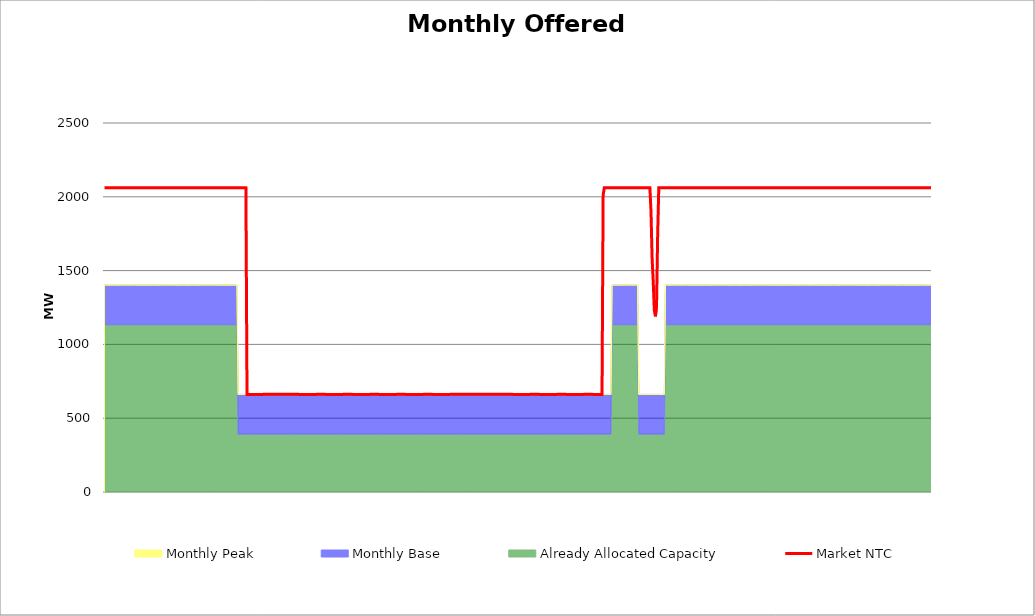
| Category | Market NTC |
|---|---|
| 0 | 2062 |
| 1 | 2062 |
| 2 | 2062 |
| 3 | 2062 |
| 4 | 2062 |
| 5 | 2062 |
| 6 | 2062 |
| 7 | 2061 |
| 8 | 2061 |
| 9 | 2061 |
| 10 | 2061 |
| 11 | 2061 |
| 12 | 2061 |
| 13 | 2061 |
| 14 | 2061 |
| 15 | 2061 |
| 16 | 2061 |
| 17 | 2061 |
| 18 | 2061 |
| 19 | 2061 |
| 20 | 2061 |
| 21 | 2061 |
| 22 | 2061 |
| 23 | 2062 |
| 24 | 2062 |
| 25 | 2062 |
| 26 | 2062 |
| 27 | 2062 |
| 28 | 2062 |
| 29 | 2062 |
| 30 | 2062 |
| 31 | 2061 |
| 32 | 2061 |
| 33 | 2061 |
| 34 | 2061 |
| 35 | 2061 |
| 36 | 2061 |
| 37 | 2061 |
| 38 | 2061 |
| 39 | 2061 |
| 40 | 2061 |
| 41 | 2061 |
| 42 | 2061 |
| 43 | 2061 |
| 44 | 2061 |
| 45 | 2061 |
| 46 | 2061 |
| 47 | 2062 |
| 48 | 2062 |
| 49 | 2062 |
| 50 | 2062 |
| 51 | 2062 |
| 52 | 2062 |
| 53 | 2062 |
| 54 | 2062 |
| 55 | 2061 |
| 56 | 2061 |
| 57 | 2061 |
| 58 | 2061 |
| 59 | 2061 |
| 60 | 2061 |
| 61 | 2061 |
| 62 | 2061 |
| 63 | 2061 |
| 64 | 2061 |
| 65 | 2061 |
| 66 | 2061 |
| 67 | 2061 |
| 68 | 2061 |
| 69 | 2061 |
| 70 | 2061 |
| 71 | 2062 |
| 72 | 2062 |
| 73 | 2062 |
| 74 | 2062 |
| 75 | 2062 |
| 76 | 2062 |
| 77 | 2062 |
| 78 | 2062 |
| 79 | 2061 |
| 80 | 2061 |
| 81 | 2061 |
| 82 | 2061 |
| 83 | 2061 |
| 84 | 2061 |
| 85 | 2061 |
| 86 | 2061 |
| 87 | 2061 |
| 88 | 2061 |
| 89 | 2061 |
| 90 | 2061 |
| 91 | 2061 |
| 92 | 2061 |
| 93 | 2061 |
| 94 | 2061 |
| 95 | 2062 |
| 96 | 2062 |
| 97 | 2062 |
| 98 | 2062 |
| 99 | 2062 |
| 100 | 2062 |
| 101 | 2062 |
| 102 | 2062 |
| 103 | 2061 |
| 104 | 2061 |
| 105 | 2061 |
| 106 | 2061 |
| 107 | 2061 |
| 108 | 2061 |
| 109 | 2061 |
| 110 | 2061 |
| 111 | 2061 |
| 112 | 2061 |
| 113 | 2061 |
| 114 | 2061 |
| 115 | 2061 |
| 116 | 2061 |
| 117 | 2061 |
| 118 | 2061 |
| 119 | 2062 |
| 120 | 2062 |
| 121 | 2062 |
| 122 | 2062 |
| 123 | 2062 |
| 124 | 2062 |
| 125 | 2062 |
| 126 | 2062 |
| 127 | 2061 |
| 128 | 661 |
| 129 | 661 |
| 130 | 661 |
| 131 | 661 |
| 132 | 661 |
| 133 | 661 |
| 134 | 661 |
| 135 | 661 |
| 136 | 661 |
| 137 | 661 |
| 138 | 661 |
| 139 | 661 |
| 140 | 661 |
| 141 | 661 |
| 142 | 661 |
| 143 | 662 |
| 144 | 662 |
| 145 | 662 |
| 146 | 662 |
| 147 | 662 |
| 148 | 662 |
| 149 | 662 |
| 150 | 662 |
| 151 | 662 |
| 152 | 662 |
| 153 | 662 |
| 154 | 662 |
| 155 | 662 |
| 156 | 662 |
| 157 | 662 |
| 158 | 662 |
| 159 | 662 |
| 160 | 662 |
| 161 | 662 |
| 162 | 662 |
| 163 | 662 |
| 164 | 662 |
| 165 | 662 |
| 166 | 662 |
| 167 | 662 |
| 168 | 662 |
| 169 | 662 |
| 170 | 662 |
| 171 | 662 |
| 172 | 662 |
| 173 | 662 |
| 174 | 662 |
| 175 | 661 |
| 176 | 661 |
| 177 | 661 |
| 178 | 661 |
| 179 | 661 |
| 180 | 661 |
| 181 | 661 |
| 182 | 661 |
| 183 | 661 |
| 184 | 661 |
| 185 | 661 |
| 186 | 661 |
| 187 | 661 |
| 188 | 661 |
| 189 | 661 |
| 190 | 661 |
| 191 | 662 |
| 192 | 662 |
| 193 | 662 |
| 194 | 662 |
| 195 | 662 |
| 196 | 662 |
| 197 | 662 |
| 198 | 662 |
| 199 | 661 |
| 200 | 661 |
| 201 | 661 |
| 202 | 661 |
| 203 | 661 |
| 204 | 661 |
| 205 | 661 |
| 206 | 661 |
| 207 | 661 |
| 208 | 661 |
| 209 | 661 |
| 210 | 661 |
| 211 | 661 |
| 212 | 661 |
| 213 | 661 |
| 214 | 661 |
| 215 | 662 |
| 216 | 662 |
| 217 | 662 |
| 218 | 662 |
| 219 | 662 |
| 220 | 662 |
| 221 | 662 |
| 222 | 662 |
| 223 | 661 |
| 224 | 661 |
| 225 | 661 |
| 226 | 661 |
| 227 | 661 |
| 228 | 661 |
| 229 | 661 |
| 230 | 661 |
| 231 | 661 |
| 232 | 661 |
| 233 | 661 |
| 234 | 661 |
| 235 | 661 |
| 236 | 661 |
| 237 | 661 |
| 238 | 661 |
| 239 | 662 |
| 240 | 662 |
| 241 | 662 |
| 242 | 662 |
| 243 | 662 |
| 244 | 662 |
| 245 | 662 |
| 246 | 662 |
| 247 | 661 |
| 248 | 661 |
| 249 | 661 |
| 250 | 661 |
| 251 | 661 |
| 252 | 661 |
| 253 | 661 |
| 254 | 661 |
| 255 | 661 |
| 256 | 661 |
| 257 | 661 |
| 258 | 661 |
| 259 | 661 |
| 260 | 661 |
| 261 | 661 |
| 262 | 661 |
| 263 | 662 |
| 264 | 662 |
| 265 | 662 |
| 266 | 662 |
| 267 | 662 |
| 268 | 662 |
| 269 | 662 |
| 270 | 662 |
| 271 | 661 |
| 272 | 661 |
| 273 | 661 |
| 274 | 661 |
| 275 | 661 |
| 276 | 661 |
| 277 | 661 |
| 278 | 661 |
| 279 | 661 |
| 280 | 661 |
| 281 | 661 |
| 282 | 661 |
| 283 | 661 |
| 284 | 661 |
| 285 | 661 |
| 286 | 661 |
| 287 | 662 |
| 288 | 662 |
| 289 | 662 |
| 290 | 662 |
| 291 | 662 |
| 292 | 662 |
| 293 | 662 |
| 294 | 662 |
| 295 | 661 |
| 296 | 661 |
| 297 | 661 |
| 298 | 661 |
| 299 | 661 |
| 300 | 661 |
| 301 | 661 |
| 302 | 661 |
| 303 | 661 |
| 304 | 661 |
| 305 | 661 |
| 306 | 661 |
| 307 | 661 |
| 308 | 661 |
| 309 | 661 |
| 310 | 661 |
| 311 | 662 |
| 312 | 662 |
| 313 | 662 |
| 314 | 662 |
| 315 | 662 |
| 316 | 662 |
| 317 | 662 |
| 318 | 662 |
| 319 | 662 |
| 320 | 662 |
| 321 | 662 |
| 322 | 662 |
| 323 | 662 |
| 324 | 662 |
| 325 | 662 |
| 326 | 662 |
| 327 | 662 |
| 328 | 662 |
| 329 | 662 |
| 330 | 662 |
| 331 | 662 |
| 332 | 662 |
| 333 | 662 |
| 334 | 662 |
| 335 | 662 |
| 336 | 662 |
| 337 | 662 |
| 338 | 662 |
| 339 | 662 |
| 340 | 662 |
| 341 | 662 |
| 342 | 662 |
| 343 | 662 |
| 344 | 662 |
| 345 | 662 |
| 346 | 662 |
| 347 | 662 |
| 348 | 662 |
| 349 | 662 |
| 350 | 662 |
| 351 | 662 |
| 352 | 662 |
| 353 | 662 |
| 354 | 662 |
| 355 | 662 |
| 356 | 662 |
| 357 | 662 |
| 358 | 662 |
| 359 | 662 |
| 360 | 662 |
| 361 | 662 |
| 362 | 662 |
| 363 | 662 |
| 364 | 662 |
| 365 | 662 |
| 366 | 662 |
| 367 | 661 |
| 368 | 661 |
| 369 | 661 |
| 370 | 661 |
| 371 | 661 |
| 372 | 661 |
| 373 | 661 |
| 374 | 661 |
| 375 | 661 |
| 376 | 661 |
| 377 | 661 |
| 378 | 661 |
| 379 | 661 |
| 380 | 661 |
| 381 | 661 |
| 382 | 661 |
| 383 | 662 |
| 384 | 662 |
| 385 | 662 |
| 386 | 662 |
| 387 | 662 |
| 388 | 662 |
| 389 | 662 |
| 390 | 662 |
| 391 | 661 |
| 392 | 661 |
| 393 | 661 |
| 394 | 661 |
| 395 | 661 |
| 396 | 661 |
| 397 | 661 |
| 398 | 661 |
| 399 | 661 |
| 400 | 661 |
| 401 | 661 |
| 402 | 661 |
| 403 | 661 |
| 404 | 661 |
| 405 | 661 |
| 406 | 661 |
| 407 | 662 |
| 408 | 662 |
| 409 | 662 |
| 410 | 662 |
| 411 | 662 |
| 412 | 662 |
| 413 | 662 |
| 414 | 662 |
| 415 | 661 |
| 416 | 661 |
| 417 | 661 |
| 418 | 661 |
| 419 | 661 |
| 420 | 661 |
| 421 | 661 |
| 422 | 661 |
| 423 | 661 |
| 424 | 661 |
| 425 | 661 |
| 426 | 661 |
| 427 | 661 |
| 428 | 661 |
| 429 | 661 |
| 430 | 661 |
| 431 | 662 |
| 432 | 662 |
| 433 | 662 |
| 434 | 662 |
| 435 | 662 |
| 436 | 662 |
| 437 | 662 |
| 438 | 662 |
| 439 | 661 |
| 440 | 661 |
| 441 | 661 |
| 442 | 661 |
| 443 | 661 |
| 444 | 661 |
| 445 | 661 |
| 446 | 661 |
| 447 | 661 |
| 448 | 2010 |
| 449 | 2061 |
| 450 | 2061 |
| 451 | 2061 |
| 452 | 2061 |
| 453 | 2061 |
| 454 | 2061 |
| 455 | 2062 |
| 456 | 2062 |
| 457 | 2062 |
| 458 | 2062 |
| 459 | 2062 |
| 460 | 2062 |
| 461 | 2062 |
| 462 | 2062 |
| 463 | 2061 |
| 464 | 2061 |
| 465 | 2061 |
| 466 | 2061 |
| 467 | 2061 |
| 468 | 2061 |
| 469 | 2061 |
| 470 | 2061 |
| 471 | 2061 |
| 472 | 2061 |
| 473 | 2061 |
| 474 | 2061 |
| 475 | 2061 |
| 476 | 2061 |
| 477 | 2061 |
| 478 | 2061 |
| 479 | 2062 |
| 480 | 2062 |
| 481 | 2062 |
| 482 | 2062 |
| 483 | 2062 |
| 484 | 2062 |
| 485 | 2062 |
| 486 | 2062 |
| 487 | 2062 |
| 488 | 2062 |
| 489 | 2062 |
| 490 | 2062 |
| 491 | 1903 |
| 492 | 1586 |
| 493 | 1427 |
| 494 | 1229 |
| 495 | 1190 |
| 496 | 1269 |
| 497 | 1745 |
| 498 | 2062 |
| 499 | 2062 |
| 500 | 2062 |
| 501 | 2062 |
| 502 | 2062 |
| 503 | 2062 |
| 504 | 2062 |
| 505 | 2062 |
| 506 | 2062 |
| 507 | 2062 |
| 508 | 2062 |
| 509 | 2062 |
| 510 | 2062 |
| 511 | 2061 |
| 512 | 2061 |
| 513 | 2061 |
| 514 | 2061 |
| 515 | 2061 |
| 516 | 2061 |
| 517 | 2061 |
| 518 | 2061 |
| 519 | 2061 |
| 520 | 2061 |
| 521 | 2061 |
| 522 | 2061 |
| 523 | 2061 |
| 524 | 2061 |
| 525 | 2061 |
| 526 | 2061 |
| 527 | 2062 |
| 528 | 2062 |
| 529 | 2062 |
| 530 | 2062 |
| 531 | 2062 |
| 532 | 2062 |
| 533 | 2062 |
| 534 | 2062 |
| 535 | 2061 |
| 536 | 2061 |
| 537 | 2061 |
| 538 | 2061 |
| 539 | 2061 |
| 540 | 2061 |
| 541 | 2061 |
| 542 | 2061 |
| 543 | 2061 |
| 544 | 2061 |
| 545 | 2061 |
| 546 | 2061 |
| 547 | 2061 |
| 548 | 2061 |
| 549 | 2061 |
| 550 | 2061 |
| 551 | 2062 |
| 552 | 2062 |
| 553 | 2062 |
| 554 | 2062 |
| 555 | 2062 |
| 556 | 2062 |
| 557 | 2062 |
| 558 | 2062 |
| 559 | 2061 |
| 560 | 2061 |
| 561 | 2061 |
| 562 | 2061 |
| 563 | 2061 |
| 564 | 2061 |
| 565 | 2061 |
| 566 | 2061 |
| 567 | 2061 |
| 568 | 2061 |
| 569 | 2061 |
| 570 | 2061 |
| 571 | 2061 |
| 572 | 2061 |
| 573 | 2061 |
| 574 | 2061 |
| 575 | 2062 |
| 576 | 2062 |
| 577 | 2062 |
| 578 | 2062 |
| 579 | 2062 |
| 580 | 2062 |
| 581 | 2062 |
| 582 | 2062 |
| 583 | 2061 |
| 584 | 2061 |
| 585 | 2061 |
| 586 | 2061 |
| 587 | 2061 |
| 588 | 2061 |
| 589 | 2061 |
| 590 | 2061 |
| 591 | 2061 |
| 592 | 2061 |
| 593 | 2061 |
| 594 | 2061 |
| 595 | 2061 |
| 596 | 2061 |
| 597 | 2061 |
| 598 | 2061 |
| 599 | 2062 |
| 600 | 2062 |
| 601 | 2062 |
| 602 | 2062 |
| 603 | 2062 |
| 604 | 2062 |
| 605 | 2062 |
| 606 | 2062 |
| 607 | 2061 |
| 608 | 2061 |
| 609 | 2061 |
| 610 | 2061 |
| 611 | 2061 |
| 612 | 2061 |
| 613 | 2061 |
| 614 | 2061 |
| 615 | 2061 |
| 616 | 2061 |
| 617 | 2061 |
| 618 | 2061 |
| 619 | 2061 |
| 620 | 2061 |
| 621 | 2061 |
| 622 | 2061 |
| 623 | 2062 |
| 624 | 2062 |
| 625 | 2062 |
| 626 | 2062 |
| 627 | 2062 |
| 628 | 2062 |
| 629 | 2062 |
| 630 | 2062 |
| 631 | 2061 |
| 632 | 2061 |
| 633 | 2061 |
| 634 | 2061 |
| 635 | 2061 |
| 636 | 2061 |
| 637 | 2061 |
| 638 | 2061 |
| 639 | 2061 |
| 640 | 2061 |
| 641 | 2061 |
| 642 | 2061 |
| 643 | 2061 |
| 644 | 2061 |
| 645 | 2061 |
| 646 | 2061 |
| 647 | 2062 |
| 648 | 2062 |
| 649 | 2062 |
| 650 | 2062 |
| 651 | 2062 |
| 652 | 2062 |
| 653 | 2062 |
| 654 | 2062 |
| 655 | 2062 |
| 656 | 2062 |
| 657 | 2062 |
| 658 | 2062 |
| 659 | 2062 |
| 660 | 2062 |
| 661 | 2062 |
| 662 | 2062 |
| 663 | 2062 |
| 664 | 2062 |
| 665 | 2062 |
| 666 | 2062 |
| 667 | 2062 |
| 668 | 2062 |
| 669 | 2062 |
| 670 | 2062 |
| 671 | 2062 |
| 672 | 2062 |
| 673 | 2062 |
| 674 | 2062 |
| 675 | 2062 |
| 676 | 2062 |
| 677 | 2062 |
| 678 | 2062 |
| 679 | 2061 |
| 680 | 2061 |
| 681 | 2061 |
| 682 | 2061 |
| 683 | 2061 |
| 684 | 2061 |
| 685 | 2061 |
| 686 | 2061 |
| 687 | 2061 |
| 688 | 2061 |
| 689 | 2061 |
| 690 | 2061 |
| 691 | 2061 |
| 692 | 2061 |
| 693 | 2061 |
| 694 | 2061 |
| 695 | 2062 |
| 696 | 2062 |
| 697 | 2062 |
| 698 | 2062 |
| 699 | 2062 |
| 700 | 2062 |
| 701 | 2062 |
| 702 | 2062 |
| 703 | 2061 |
| 704 | 2061 |
| 705 | 2061 |
| 706 | 2061 |
| 707 | 2061 |
| 708 | 2061 |
| 709 | 2061 |
| 710 | 2061 |
| 711 | 2061 |
| 712 | 2061 |
| 713 | 2061 |
| 714 | 2061 |
| 715 | 2061 |
| 716 | 2061 |
| 717 | 2061 |
| 718 | 2061 |
| 719 | 2062 |
| 720 | 2062 |
| 721 | 2062 |
| 722 | 2062 |
| 723 | 2062 |
| 724 | 2062 |
| 725 | 2062 |
| 726 | 2062 |
| 727 | 2061 |
| 728 | 2061 |
| 729 | 2061 |
| 730 | 2061 |
| 731 | 2061 |
| 732 | 2061 |
| 733 | 2061 |
| 734 | 2061 |
| 735 | 2061 |
| 736 | 2061 |
| 737 | 2061 |
| 738 | 2061 |
| 739 | 2061 |
| 740 | 2061 |
| 741 | 2061 |
| 742 | 2061 |
| 743 | 2062 |